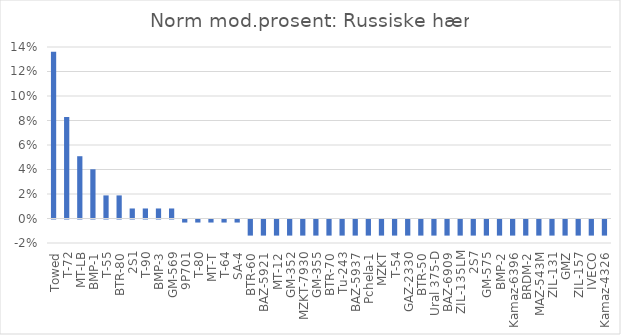
| Category | Series 0 |
|---|---|
| Towed | 0.136 |
| T-72 | 0.083 |
| MT-LB | 0.051 |
| BMP-1 | 0.04 |
| T-55 | 0.019 |
| BTR-80 | 0.019 |
| 2S1 | 0.008 |
| T-90 | 0.008 |
| BMP-3 | 0.008 |
| GM-569 | 0.008 |
| 9P701 | -0.002 |
| T-80 | -0.002 |
| MT-T | -0.002 |
| T-64 | -0.002 |
| SA-4 | -0.002 |
| BTR-60 | -0.013 |
| BAZ-5921 | -0.013 |
| MT-12 | -0.013 |
| GM-352 | -0.013 |
| MZKT-7930 | -0.013 |
| GM-355 | -0.013 |
| BTR-70 | -0.013 |
| Tu-243 | -0.013 |
| BAZ-5937 | -0.013 |
| Pchela-1 | -0.013 |
| MZKT | -0.013 |
| T-54 | -0.013 |
| GAZ-2330 | -0.013 |
| BTR-50 | -0.013 |
| Ural 375-D | -0.013 |
| BAZ-6909 | -0.013 |
| ZIL-135LM | -0.013 |
| 2S7 | -0.013 |
|  GM-575 | -0.013 |
| BMP-2 | -0.013 |
| Kamaz-6396 | -0.013 |
| BRDM-2 | -0.013 |
| MAZ-543M | -0.013 |
| ZIL-131 | -0.013 |
| GMZ | -0.013 |
| ZIL-157 | -0.013 |
| IVECO | -0.013 |
| Kamaz-4326 | -0.013 |